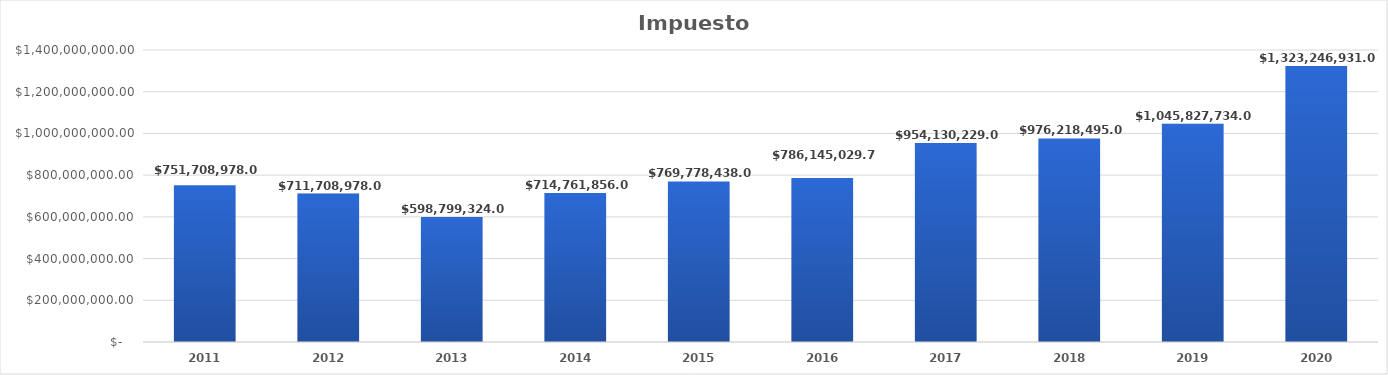
| Category | Impuesto Predial |
|---|---|
| 2011.0 | 751708978 |
| 2012.0 | 711708978 |
| 2013.0 | 598799324 |
| 2014.0 | 714761856 |
| 2015.0 | 769778438 |
| 2016.0 | 786145029.7 |
| 2017.0 | 954130229 |
| 2018.0 | 976218495 |
| 2019.0 | 1045827734 |
| 2020.0 | 1323246931 |